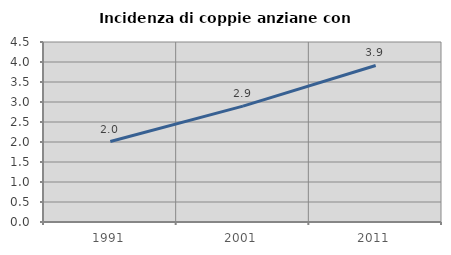
| Category | Incidenza di coppie anziane con figli |
|---|---|
| 1991.0 | 2.011 |
| 2001.0 | 2.896 |
| 2011.0 | 3.914 |